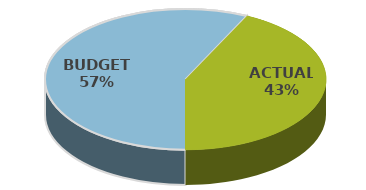
| Category | Series 0 |
|---|---|
| BUDGET | 1085000 |
| ACTUAL | 812000 |